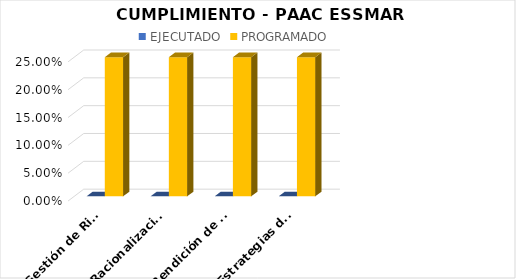
| Category | EJECUTADO | PROGRAMADO |
|---|---|---|
| Gestión de Riesgo | 0 | 0.25 |
| Racionalización de Trámites | 0 | 0.25 |
| Rendición de Cuentas | 0 | 0.25 |
| Estrategias de Servicio al Ciudadano e implementación de la Ley de Transparencia y Atención al Ciudadano | 0 | 0.25 |